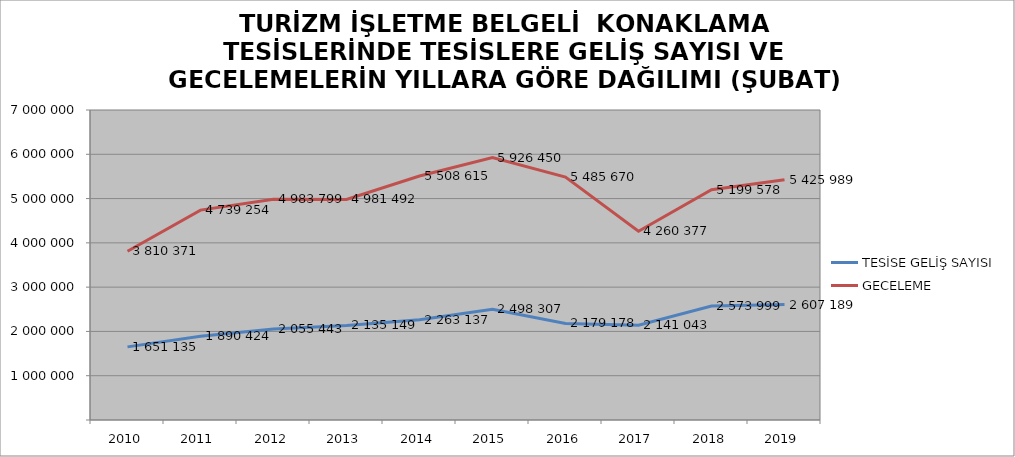
| Category | TESİSE GELİŞ SAYISI | GECELEME |
|---|---|---|
| 2010 | 1651135 | 3810371 |
| 2011 | 1890424 | 4739254 |
| 2012 | 2055443 | 4983799 |
| 2013 | 2135149 | 4981492 |
| 2014 | 2263137 | 5508615 |
| 2015 | 2498307 | 5926450 |
| 2016 | 2179178 | 5485670 |
| 2017 | 2141043 | 4260377 |
| 2018 | 2573999 | 5199578 |
| 2019 | 2607189 | 5425989 |